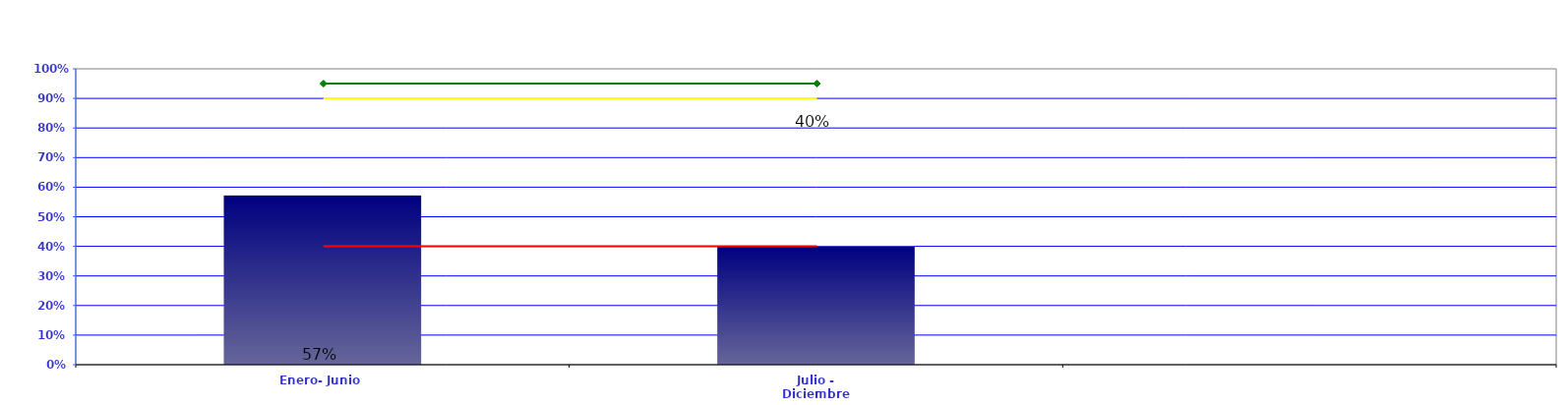
| Category | LOGROS |
|---|---|
| Enero- Junio | 0.572 |
| Julio - Diciembre | 0.4 |